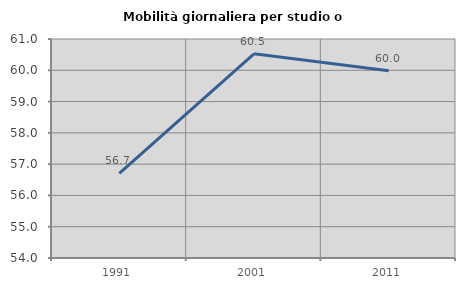
| Category | Mobilità giornaliera per studio o lavoro |
|---|---|
| 1991.0 | 56.707 |
| 2001.0 | 60.528 |
| 2011.0 | 59.982 |